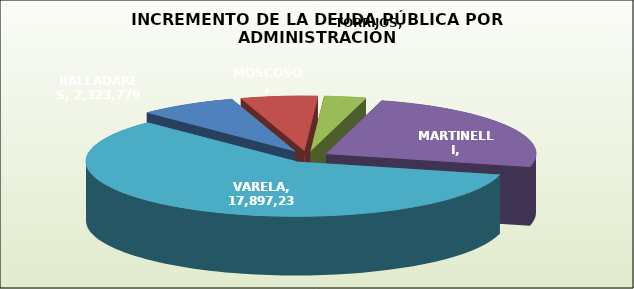
| Category | ENDARA |
|---|---|
| BALLADARES | 2323779 |
| MOSCOSO | 1802780 |
| TORRIJOS | 984251 |
| MARTINELLI | 7491196 |
| VARELA | 17897232 |